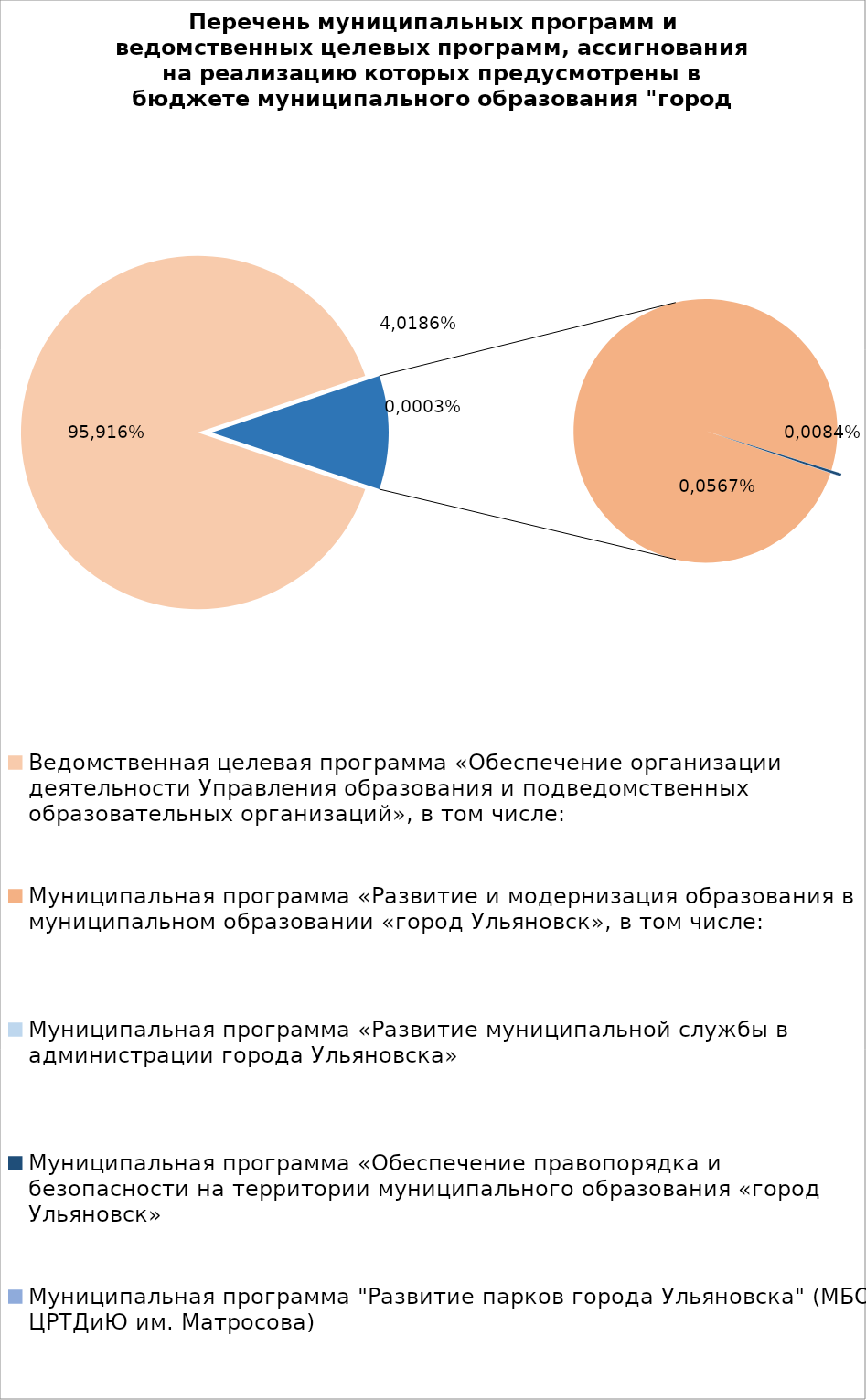
| Category | Series 0 |
|---|---|
| Ведомственная целевая программа «Обеспечение организации деятельности Управления образования и подведомственных образовательных организаций», в том числе: | 7418300.29 |
| Муниципальная программа «Развитие и модернизация образования в муниципальном образовании «город Ульяновск», в том числе: | 857386.14 |
| Муниципальная программа «Развитие муниципальной службы в администрации города Ульяновска» | 14.3 |
| Муниципальная программа «Обеспечение правопорядка и безопасности на территории муниципального образования «город Ульяновск» | 2700 |
| Муниципальная программа "Развитие парков города Ульяновска" (МБОУ ЦРТДиЮ им. Матросова) | 400 |